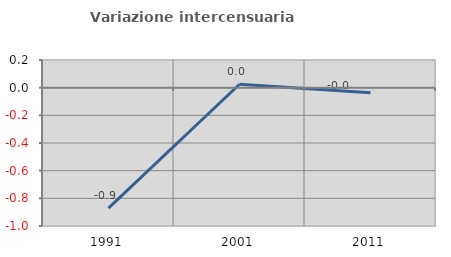
| Category | Variazione intercensuaria annua |
|---|---|
| 1991.0 | -0.87 |
| 2001.0 | 0.025 |
| 2011.0 | -0.037 |